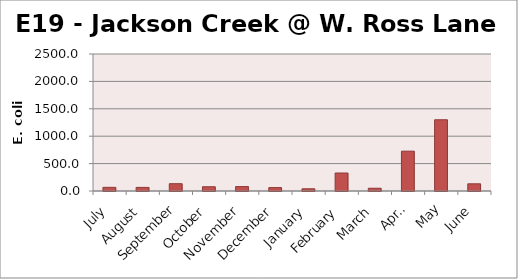
| Category | E. coli MPN |
|---|---|
| July | 67 |
| August | 65.7 |
| September | 133.3 |
| October | 77.6 |
| November | 80.9 |
| December | 62 |
| January | 40.4 |
| February | 328.2 |
| March | 50.4 |
| April | 727 |
| May | 1299.7 |
| June | 131.4 |